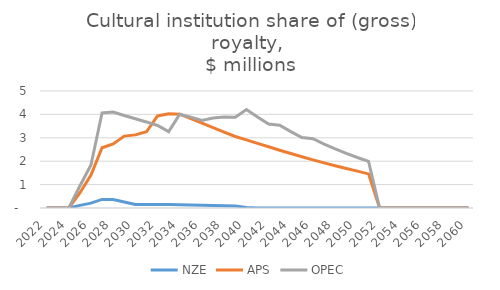
| Category | NZE | APS | OPEC |
|---|---|---|---|
| 2022.0 | 0 | 0 | 0 |
| 2023.0 | 0 | 0 | 0 |
| 2024.0 | 0 | 0 | 0 |
| 2025.0 | 0.112 | 0.643 | 0.94 |
| 2026.0 | 0.208 | 1.41 | 1.84 |
| 2027.0 | 0.367 | 2.575 | 4.059 |
| 2028.0 | 0.367 | 2.74 | 4.098 |
| 2029.0 | 0.26 | 3.071 | 3.954 |
| 2030.0 | 0.152 | 3.125 | 3.814 |
| 2031.0 | 0.152 | 3.258 | 3.678 |
| 2032.0 | 0.152 | 3.934 | 3.526 |
| 2033.0 | 0.146 | 4.027 | 3.263 |
| 2034.0 | 0.137 | 4.009 | 4.009 |
| 2035.0 | 0.126 | 3.819 | 3.882 |
| 2036.0 | 0.116 | 3.627 | 3.74 |
| 2037.0 | 0.107 | 3.434 | 3.842 |
| 2038.0 | 0.099 | 3.243 | 3.885 |
| 2039.0 | 0.091 | 3.056 | 3.88 |
| 2040.0 | 0.025 | 2.91 | 4.208 |
| 2041.0 | 0 | 2.763 | 3.893 |
| 2042.0 | 0 | 2.616 | 3.59 |
| 2043.0 | 0 | 2.47 | 3.539 |
| 2044.0 | 0 | 2.328 | 3.266 |
| 2045.0 | 0 | 2.19 | 3.014 |
| 2046.0 | 0 | 2.056 | 2.961 |
| 2047.0 | 0 | 1.928 | 2.734 |
| 2048.0 | 0 | 1.805 | 2.526 |
| 2049.0 | 0 | 1.688 | 2.334 |
| 2050.0 | 0 | 1.576 | 2.158 |
| 2051.0 | 0 | 1.458 | 1.996 |
| 2052.0 | 0 | 0 | 0 |
| 2053.0 | 0 | 0 | 0 |
| 2054.0 | 0 | 0 | 0 |
| 2055.0 | 0 | 0 | 0 |
| 2056.0 | 0 | 0 | 0 |
| 2057.0 | 0 | 0 | 0 |
| 2058.0 | 0 | 0 | 0 |
| 2059.0 | 0 | 0 | 0 |
| 2060.0 | 0 | 0 | 0 |